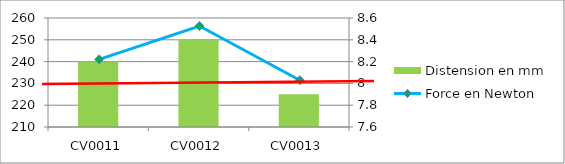
| Category | Distension en mm |
|---|---|
| CV0011 | 8.2 |
| CV0012 | 8.4 |
| CV0013 | 7.9 |